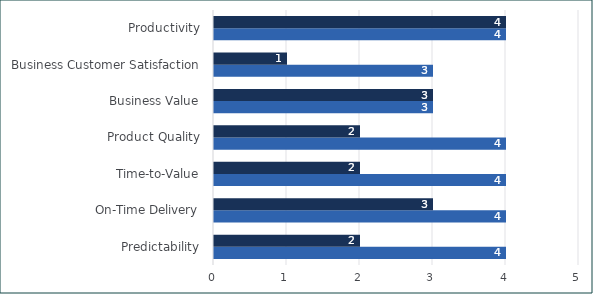
| Category | Series 2 | Series 0 |
|---|---|---|
| Predictability | 4 | 2 |
| On-Time Delivery | 4 | 3 |
| Time-to-Value | 4 | 2 |
| Product Quality | 4 | 2 |
| Business Value | 3 | 3 |
| Business Customer Satisfaction | 3 | 1 |
| Productivity | 4 | 4 |